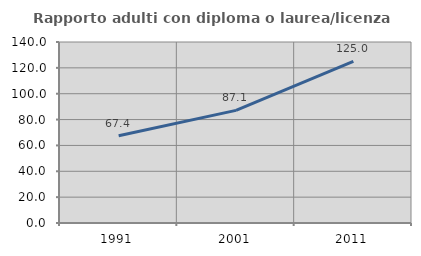
| Category | Rapporto adulti con diploma o laurea/licenza media  |
|---|---|
| 1991.0 | 67.417 |
| 2001.0 | 87.121 |
| 2011.0 | 125.039 |